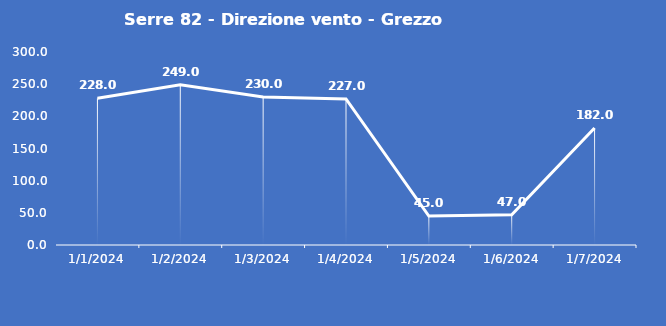
| Category | Serre 82 - Direzione vento - Grezzo (°N) |
|---|---|
| 1/1/24 | 228 |
| 1/2/24 | 249 |
| 1/3/24 | 230 |
| 1/4/24 | 227 |
| 1/5/24 | 45 |
| 1/6/24 | 47 |
| 1/7/24 | 182 |